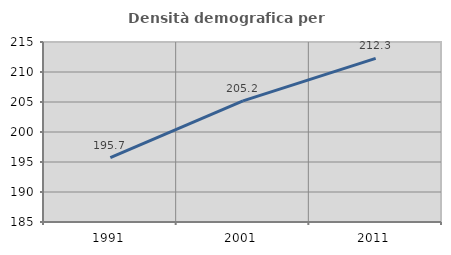
| Category | Densità demografica |
|---|---|
| 1991.0 | 195.738 |
| 2001.0 | 205.176 |
| 2011.0 | 212.27 |